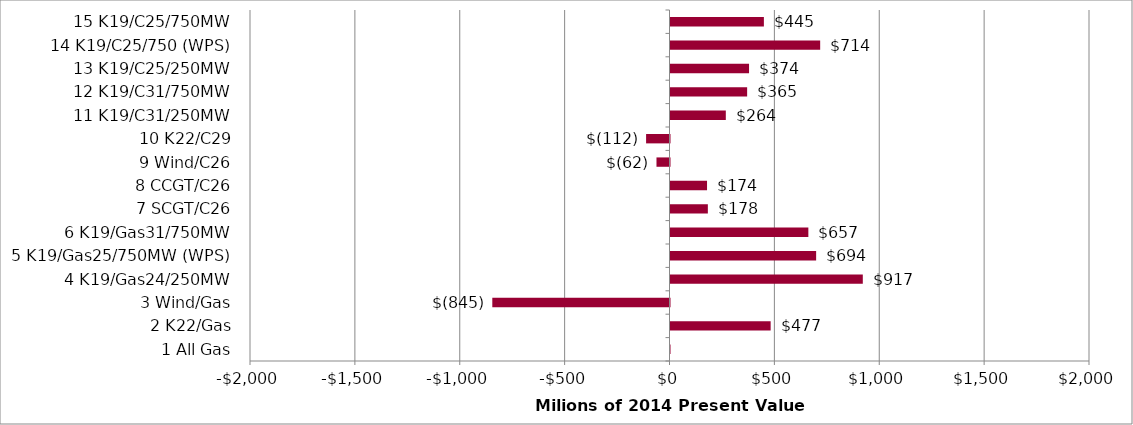
| Category | 50 NPV |
|---|---|
| 1 All Gas | 0.002 |
| 2 K22/Gas | 477.45 |
| 3 Wind/Gas | -844.801 |
| 4 K19/Gas24/250MW | 916.815 |
| 5 K19/Gas25/750MW (WPS) | 694.317 |
| 6 K19/Gas31/750MW | 657.223 |
| 7 SCGT/C26 | 178.06 |
| 8 CCGT/C26 | 174.197 |
| 9 Wind/C26 | -62.053 |
| 10 K22/C29 | -111.615 |
| 11 K19/C31/250MW | 263.703 |
| 12 K19/C31/750MW | 365.387 |
| 13 K19/C25/250MW | 374.494 |
| 14 K19/C25/750 (WPS) | 713.592 |
| 15 K19/C25/750MW | 445.216 |